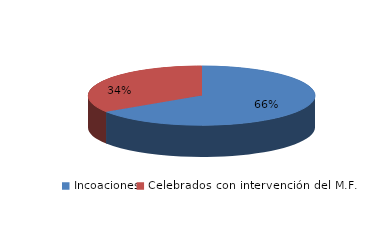
| Category | Series 0 |
|---|---|
| Incoaciones | 4203 |
| Celebrados con intervención del M.F. | 2180 |